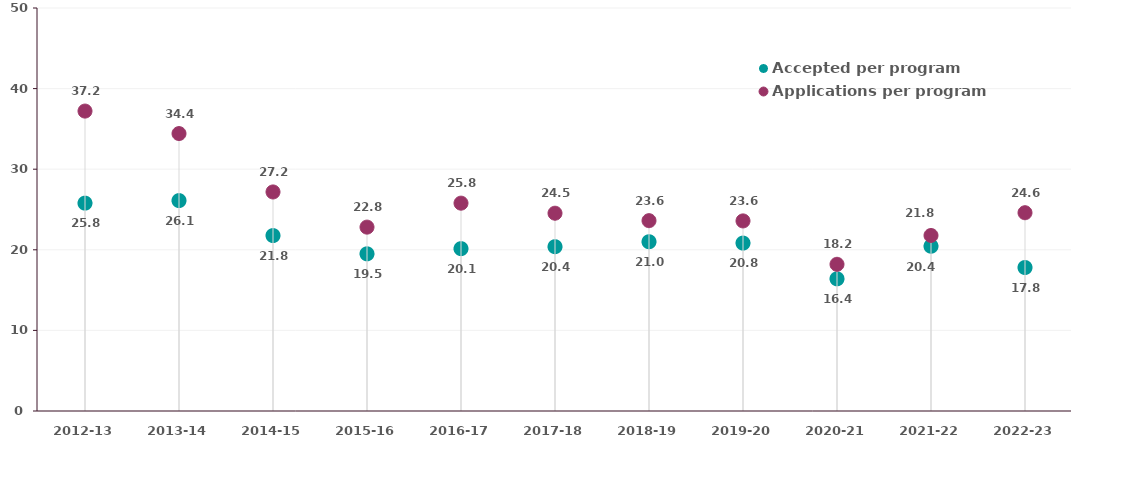
| Category | Accepted per program | Applications per program |
|---|---|---|
| 2012-13 | 25.789 | 37.211 |
| 2013-14 | 26.105 | 34.421 |
| 2014-15 | 21.765 | 27.176 |
| 2015-16 | 19.5 | 22.812 |
| 2016-17 | 20.143 | 25.786 |
| 2017-18 | 20.385 | 24.538 |
| 2018-19 | 21 | 23.615 |
| 2019-20 | 20.833 | 23.583 |
| 2020-21 | 16.4 | 18.2 |
| 2021-22 | 20.444 | 21.778 |
| 2022-23 | 17.8 | 24.6 |